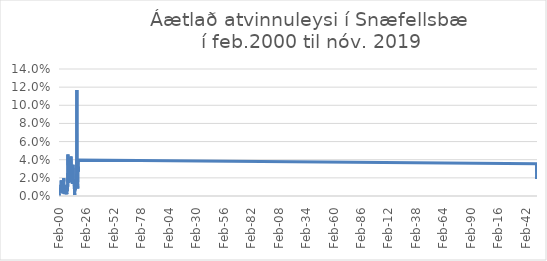
| Category | Áætlað atvinnuleysi |
|---|---|
| 2000-02-01 | 0.003 |
| 2000-03-01 | 0.004 |
| 2000-04-01 | 0 |
| 2000-05-01 | 0.002 |
| 2000-06-01 | 0.004 |
| 2000-07-01 | 0.005 |
| 2000-08-01 | 0.007 |
| 2000-09-01 | 0.006 |
| 2000-10-01 | 0.009 |
| 2000-11-01 | 0.009 |
| 2000-12-01 | 0.009 |
| 2001-01-01 | 0.007 |
| 2001-02-01 | 0.004 |
| 2001-03-01 | 0.005 |
| 2001-04-01 | 0.007 |
| 2001-05-01 | 0.004 |
| 2001-06-01 | 0.004 |
| 2001-07-01 | 0.005 |
| 2001-08-01 | 0.004 |
| 2001-09-01 | 0.003 |
| 2001-10-01 | 0.005 |
| 2001-11-01 | 0.006 |
| 2001-12-01 | 0.009 |
| 2002-01-01 | 0.012 |
| 2002-02-01 | 0.009 |
| 2002-03-01 | 0.013 |
| 2002-04-01 | 0.017 |
| 2002-05-01 | 0.012 |
| 2002-06-01 | 0.011 |
| 2002-07-01 | 0.01 |
| 2002-08-01 | 0.011 |
| 2002-09-01 | 0.011 |
| 2002-10-01 | 0.011 |
| 2002-11-01 | 0.016 |
| 2002-12-01 | 0.012 |
| 2003-01-01 | 0.011 |
| 2003-02-01 | 0.016 |
| 2003-03-01 | 0.016 |
| 2003-04-01 | 0.015 |
| 2003-05-01 | 0.011 |
| 2003-06-01 | 0.011 |
| 2003-07-01 | 0.011 |
| 2003-08-01 | 0.005 |
| 2003-09-01 | 0.004 |
| 2003-10-01 | 0.003 |
| 2003-11-01 | 0.002 |
| 2003-12-01 | 0.007 |
| 2004-01-01 | 0.008 |
| 2004-02-01 | 0.008 |
| 2004-03-01 | 0.01 |
| 2004-04-01 | 0.012 |
| 2004-05-01 | 0.011 |
| 2004-06-01 | 0.01 |
| 2004-07-01 | 0.019 |
| 2004-08-01 | 0.012 |
| 2004-09-01 | 0.008 |
| 2004-10-01 | 0.011 |
| 2004-11-01 | 0.004 |
| 2004-12-01 | 0.004 |
| 2005-01-01 | 0.002 |
| 2005-02-01 | 0.003 |
| 2005-03-01 | 0.002 |
| 2005-04-01 | 0.004 |
| 2005-05-01 | 0.004 |
| 2005-06-01 | 0.005 |
| 2005-07-01 | 0.007 |
| 2005-08-01 | 0.007 |
| 2005-09-01 | 0.005 |
| 2005-10-01 | 0.005 |
| 2005-11-01 | 0.003 |
| 2005-12-01 | 0.004 |
| 2006-01-01 | 0.008 |
| 2006-02-01 | 0.011 |
| 2006-03-01 | 0.01 |
| 2006-04-01 | 0.008 |
| 2006-05-01 | 0.009 |
| 2006-06-01 | 0.007 |
| 2006-07-01 | 0.01 |
| 2006-08-01 | 0.011 |
| 2006-09-01 | 0.009 |
| 2006-10-01 | 0.008 |
| 2006-11-01 | 0.005 |
| 2006-12-01 | 0.006 |
| 2007-01-01 | 0.007 |
| 2007-02-01 | 0.007 |
| 2007-03-01 | 0.007 |
| 2007-04-01 | 0.008 |
| 2007-05-01 | 0.007 |
| 2007-06-01 | 0.002 |
| 2007-07-01 | 0.005 |
| 2007-08-01 | 0.006 |
| 2007-09-01 | 0.01 |
| 2007-10-01 | 0.012 |
| 2007-11-01 | 0.008 |
| 2007-12-01 | 0.005 |
| 2008-01-01 | 0.012 |
| 2008-02-01 | 0.012 |
| 2008-03-01 | 0.012 |
| 2008-04-01 | 0.009 |
| 2008-05-01 | 0.025 |
| 2008-06-01 | 0.044 |
| 2008-07-01 | 0.046 |
| 2008-08-01 | 0.034 |
| 2008-09-01 | 0.018 |
| 2008-10-01 | 0.014 |
| 2008-11-01 | 0.019 |
| 2008-12-01 | 0.02 |
| 2009-01-01 | 0.019 |
| 2009-02-01 | 0.02 |
| 2009-03-01 | 0.025 |
| 2009-04-01 | 0.024 |
| 2009-05-01 | 0.021 |
| 2009-06-01 | 0.02 |
| 2009-07-01 | 0.041 |
| 2009-08-01 | 0.026 |
| 2009-09-01 | 0.017 |
| 2009-10-01 | 0.023 |
| 2009-11-01 | 0.03 |
| 2009-12-01 | 0.026 |
| 2010-01-01 | 0.027 |
| 2010-02-01 | 0.027 |
| 2010-03-01 | 0.026 |
| 2010-04-01 | 0.028 |
| 2010-05-01 | 0.035 |
| 2010-06-01 | 0.036 |
| 2010-07-01 | 0.042 |
| 2010-08-01 | 0.029 |
| 2010-09-01 | 0.023 |
| 2010-10-01 | 0.024 |
| 2010-11-01 | 0.023 |
| 2010-12-01 | 0.023 |
| 2011-01-01 | 0.026 |
| 2011-02-01 | 0.033 |
| 2011-03-01 | 0.035 |
| 2011-04-01 | 0.03 |
| 2011-05-01 | 0.03 |
| 2011-06-01 | 0.039 |
| 2011-07-01 | 0.044 |
| 2011-08-01 | 0.025 |
| 2011-09-01 | 0.018 |
| 2011-10-01 | 0.017 |
| 2011-11-01 | 0.017 |
| 2011-12-01 | 0.015 |
| 2012-01-01 | 0.018 |
| 2012-02-01 | 0.016 |
| 2012-03-01 | 0.021 |
| 2012-04-01 | 0.02 |
| 2012-05-01 | 0.016 |
| 2012-06-01 | 0.03 |
| 2012-07-01 | 0.034 |
| 2012-08-01 | 0.033 |
| 2012-09-01 | 0.018 |
| 2012-10-01 | 0.014 |
| 2012-11-01 | 0.017 |
| 2012-12-01 | 0.016 |
| 2013-01-01 | 0.014 |
| 2013-02-01 | 0.016 |
| 2013-03-01 | 0.02 |
| 2013-04-01 | 0.021 |
| 2013-05-01 | 0.022 |
| 2013-06-01 | 0.034 |
| 2013-07-01 | 0.034 |
| 2013-08-01 | 0.035 |
| 2013-09-01 | 0.018 |
| 2013-10-01 | 0.018 |
| 2013-11-01 | 0.016 |
| 2013-12-01 | 0.015 |
| 2014-01-01 | 0.018 |
| 2014-02-01 | 0.017 |
| 2014-03-01 | 0.017 |
| 2014-04-01 | 0.016 |
| 2014-05-01 | 0.014 |
| 2014-06-01 | 0.018 |
| 2014-07-01 | 0.018 |
| 2014-08-01 | 0.011 |
| 2014-09-01 | 0.011 |
| 2014-10-01 | 0.003 |
| 2014-11-01 | 0.003 |
| 2014-12-01 | 0.001 |
| 2015-01-01 | 0.003 |
| 2015-02-01 | 0.003 |
| 2015-03-01 | 0.005 |
| 2015-04-01 | 0.009 |
| 2015-05-01 | 0.006 |
| 2015-06-01 | 0.017 |
| 2015-07-01 | 0.016 |
| 2015-08-01 | 0.015 |
| 2015-09-01 | 0.015 |
| 2015-10-01 | 0.009 |
| 2015-11-01 | 0.012 |
| 2015-12-01 | 0.016 |
| 2016-01-01 | 0.016 |
| 2016-02-01 | 0.015 |
| 2016-03-01 | 0.012 |
| 2016-04-01 | 0.011 |
| 2016-05-01 | 0.009 |
| 2016-06-01 | 0.016 |
| 2016-07-01 | 0.016 |
| 2016-08-01 | 0.024 |
| 2016-09-01 | 0.022 |
| 2016-10-01 | 0.021 |
| 2016-11-01 | 0.019 |
| 2016-12-01 | 0.04 |
| 2017-01-01 | 0.117 |
| 2017-02-01 | 0.029 |
| 2017-03-01 | 0.025 |
| 2017-04-01 | 0.024 |
| 2017-05-01 | 0.023 |
| 2017-06-01 | 0.033 |
| 2017-07-01 | 0.031 |
| 2017-08-01 | 0.031 |
| 2017-09-01 | 0.017 |
| 2017-10-01 | 0.008 |
| 2017-11-01 | 0.014 |
| 2017-12-01 | 0.015 |
| 2018-01-01 | 0.016 |
| 2018-02-01 | 0.018 |
| 2018-03-01 | 0.029 |
| 2018-04-01 | 0.032 |
| 2018-05-01 | 0.027 |
| 2018-06-01 | 0.032 |
| 2018-07-01 | 0.04 |
| 201808.0 | 0.036 |
| 201809.0 | 0.025 |
| 201810.0 | 0.022 |
| 201811.0 | 0.019 |
| 201812.0 | 0.019 |
| 201901.0 | 0.023 |
| 201902.0 | 0.022 |
| 201903.0 | 0.022 |
| 201904.0 | 0.025 |
| 201905.0 | 0.032 |
| 201906.0 | 0.033 |
| 201907.0 | 0.027 |
| 201908.0 | 0.034 |
| 201909.0 | 0.024 |
| 201910.0 | 0.019 |
| 201911.0 | 0.02 |